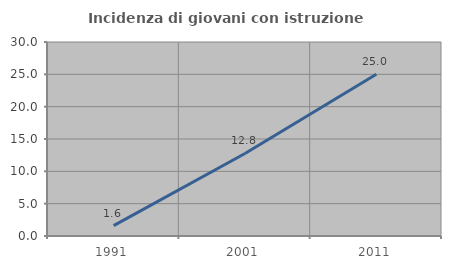
| Category | Incidenza di giovani con istruzione universitaria |
|---|---|
| 1991.0 | 1.613 |
| 2001.0 | 12.766 |
| 2011.0 | 25 |